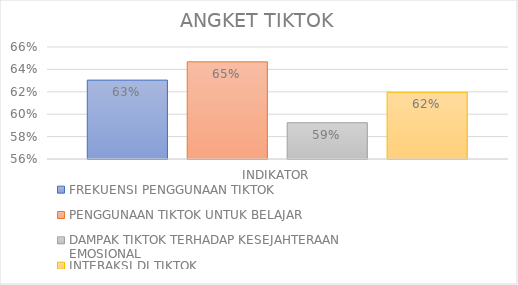
| Category | FREKUENSI PENGGUNAAN TIKTOK | PENGGUNAAN TIKTOK UNTUK BELAJAR | DAMPAK TIKTOK TERHADAP KESEJAHTERAAN EMOSIONAL | INTERAKSI DI TIKTOK |
|---|---|---|---|---|
| INDIKATOR | 0.63 | 0.647 | 0.592 | 0.62 |